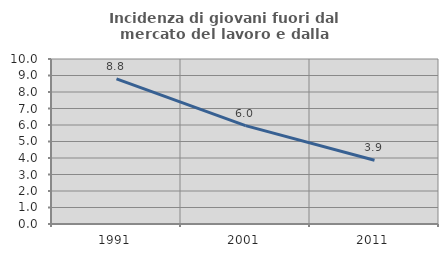
| Category | Incidenza di giovani fuori dal mercato del lavoro e dalla formazione  |
|---|---|
| 1991.0 | 8.795 |
| 2001.0 | 5.962 |
| 2011.0 | 3.859 |